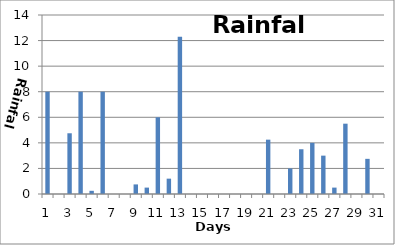
| Category | Rain |
|---|---|
| 0 | 8 |
| 1 | 0 |
| 2 | 4.75 |
| 3 | 8 |
| 4 | 0.25 |
| 5 | 8 |
| 6 | 0 |
| 7 | 0 |
| 8 | 0.75 |
| 9 | 0.5 |
| 10 | 6 |
| 11 | 1.2 |
| 12 | 12.3 |
| 13 | 0 |
| 14 | 0 |
| 15 | 0 |
| 16 | 0 |
| 17 | 0 |
| 18 | 0 |
| 19 | 0 |
| 20 | 4.25 |
| 21 | 0 |
| 22 | 2 |
| 23 | 3.5 |
| 24 | 4 |
| 25 | 3 |
| 26 | 0.5 |
| 27 | 5.5 |
| 28 | 0 |
| 29 | 2.75 |
| 30 | 0 |